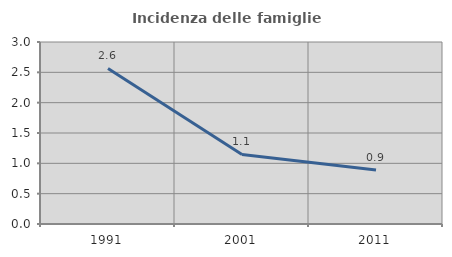
| Category | Incidenza delle famiglie numerose |
|---|---|
| 1991.0 | 2.564 |
| 2001.0 | 1.146 |
| 2011.0 | 0.89 |